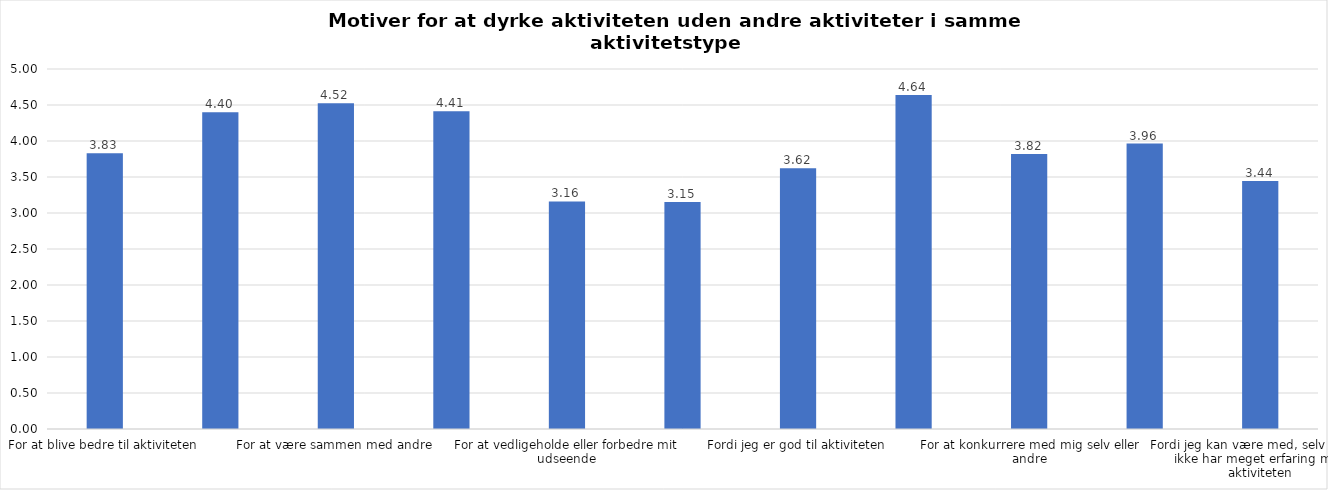
| Category | Gennemsnit |
|---|---|
| For at blive bedre til aktiviteten | 3.83 |
| For at vedligeholde eller forbedre min sundhed (fx helbred, fysisk form) | 4.398 |
| For at være sammen med andre | 4.523 |
| For at gøre noget godt for mig selv | 4.413 |
| For at vedligeholde eller forbedre mit udseende | 3.161 |
| Fordi andre i min omgangskreds opmuntrer mig til det | 3.153 |
| Fordi jeg er god til aktiviteten | 3.623 |
| Fordi jeg godt kan lide aktiviteten | 4.638 |
| For at konkurrere med mig selv eller andre | 3.82 |
| Fordi aktiviteten passer godt ind i min hverdag | 3.964 |
| Fordi jeg kan være med, selv om jeg ikke har meget erfaring med aktiviteten | 3.443 |